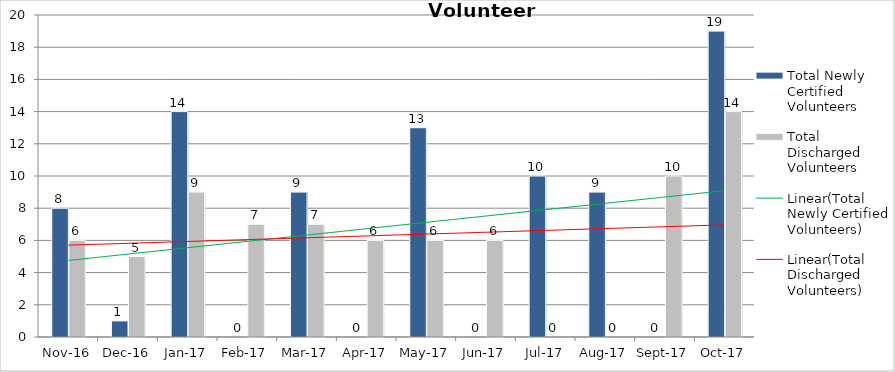
| Category | Total Newly Certified Volunteers | Total Discharged Volunteers |
|---|---|---|
| 2016-11-01 | 8 | 6 |
| 2016-12-01 | 1 | 5 |
| 2017-01-01 | 14 | 9 |
| 2017-02-01 | 0 | 7 |
| 2017-03-01 | 9 | 7 |
| 2017-04-01 | 0 | 6 |
| 2017-05-01 | 13 | 6 |
| 2017-06-01 | 0 | 6 |
| 2017-07-01 | 10 | 0 |
| 2017-08-01 | 9 | 0 |
| 2017-09-01 | 0 | 10 |
| 2017-10-01 | 19 | 14 |